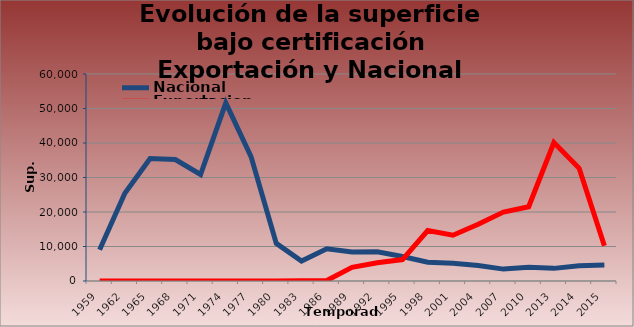
| Category | Nacional | Exportacion |
|---|---|---|
| 1959.0 | 9053 | 0 |
| 1962.0 | 25417 | 0 |
| 1965.0 | 35485 | 0 |
| 1968.0 | 35216 | 0 |
| 1971.0 | 30869 | 0 |
| 1974.0 | 51638 | 0 |
| 1977.0 | 36049 | 0 |
| 1980.0 | 10916 | 0 |
| 1983.0 | 5799 | 67 |
| 1986.0 | 9313 | 134 |
| 1989.0 | 8433 | 3957 |
| 1992.0 | 8479 | 5276 |
| 1995.0 | 7087 | 6206 |
| 1998.0 | 5461 | 14621 |
| 2001.0 | 5121 | 13275 |
| 2004.0 | 4517 | 16439 |
| 2007.0 | 3448 | 19979 |
| 2010.0 | 3989 | 21512 |
| 2013.0 | 3662 | 40125 |
| 2014.0 | 4409 | 32693 |
| 2015.0 | 4636 | 10219 |